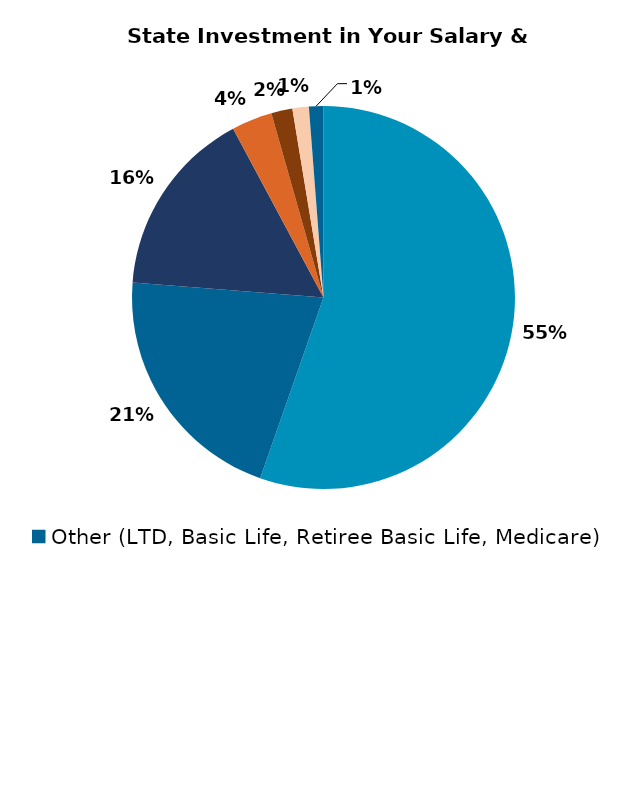
| Category | Series 0 |
|---|---|
| Salary | 1500 |
| Medical Insurance | 566 |
| Pension* | 431.25 |
| Social Security** | 93 |
| Retiree Medical Insurance | 48.45 |
| MO Deferred Compensation Match*** | 37.5 |
| Other (LTD, Basic Life, Retiree Basic Life, Medicare) | 33.03 |